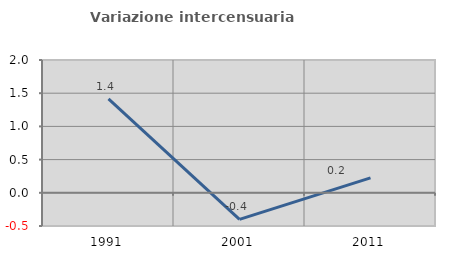
| Category | Variazione intercensuaria annua |
|---|---|
| 1991.0 | 1.414 |
| 2001.0 | -0.4 |
| 2011.0 | 0.225 |